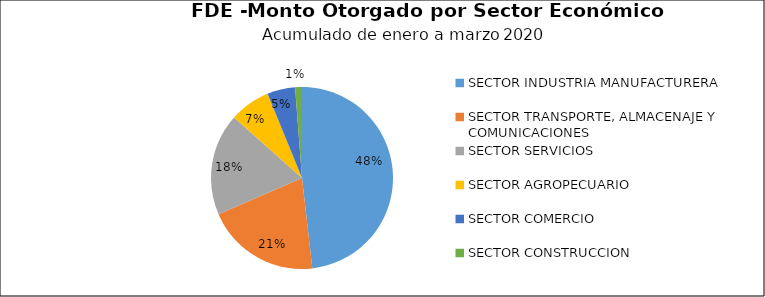
| Category | Monto | Créditos |
|---|---|---|
| SECTOR INDUSTRIA MANUFACTURERA | 3.886 | 67 |
| SECTOR TRANSPORTE, ALMACENAJE Y COMUNICACIONES | 1.637 | 2 |
| SECTOR SERVICIOS | 1.46 | 14 |
| SECTOR AGROPECUARIO | 0.584 | 5 |
| SECTOR COMERCIO | 0.401 | 8 |
| SECTOR CONSTRUCCION | 0.098 | 1 |